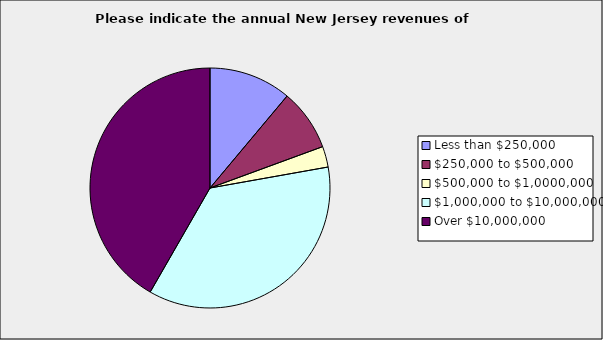
| Category | Series 0 |
|---|---|
| Less than $250,000 | 0.111 |
| $250,000 to $500,000 | 0.083 |
| $500,000 to $1,0000,000 | 0.028 |
| $1,000,000 to $10,000,000 | 0.361 |
| Over $10,000,000 | 0.417 |